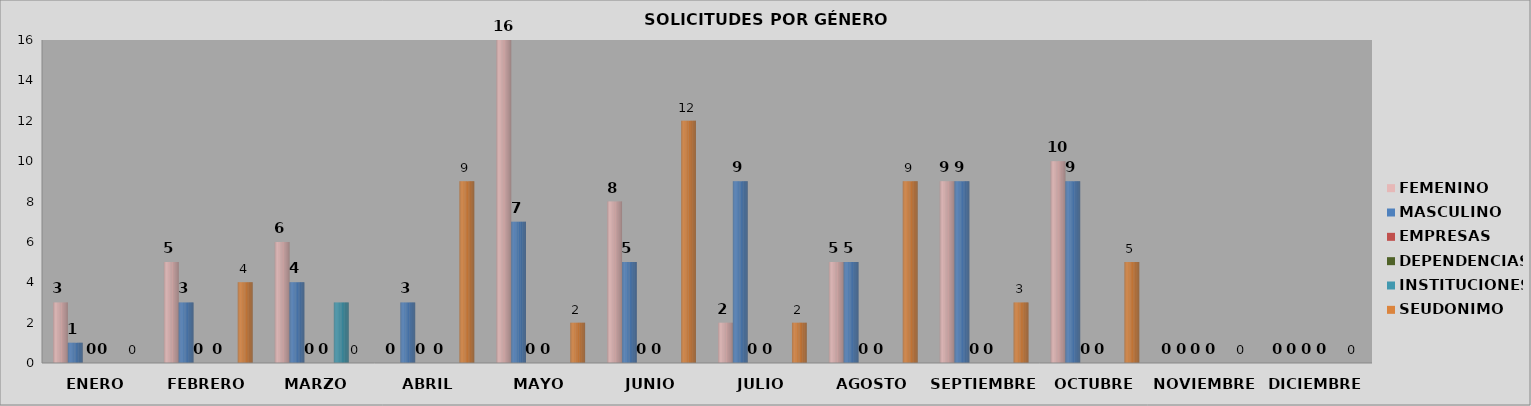
| Category | FEMENINO | MASCULINO | EMPRESAS | DEPENDENCIAS | INSTITUCIONES | SEUDONIMO |
|---|---|---|---|---|---|---|
| ENERO | 3 | 1 | 0 | 0 | 0 | 0 |
| FEBRERO | 5 | 3 | 0 | 0 | 0 | 4 |
| MARZO  | 6 | 4 | 0 | 0 | 3 | 0 |
| ABRIL | 0 | 3 | 0 | 0 | 0 | 9 |
| MAYO | 16 | 7 | 0 | 0 | 0 | 2 |
| JUNIO | 8 | 5 | 0 | 0 | 0 | 12 |
| JULIO | 2 | 9 | 0 | 0 | 0 | 2 |
| AGOSTO | 5 | 5 | 0 | 0 | 0 | 9 |
| SEPTIEMBRE | 9 | 9 | 0 | 0 | 0 | 3 |
| OCTUBRE | 10 | 9 | 0 | 0 | 0 | 5 |
| NOVIEMBRE | 0 | 0 | 0 | 0 | 0 | 0 |
| DICIEMBRE | 0 | 0 | 0 | 0 | 0 | 0 |